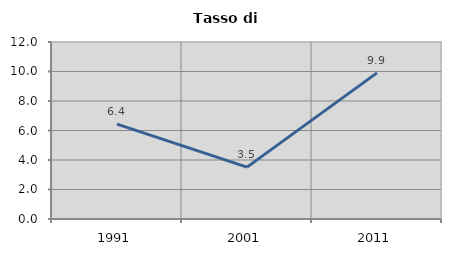
| Category | Tasso di disoccupazione   |
|---|---|
| 1991.0 | 6.431 |
| 2001.0 | 3.516 |
| 2011.0 | 9.906 |